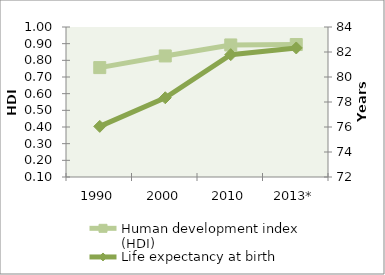
| Category | Human development index (HDI) |
|---|---|
| 1990 | 0.756 |
| 2000 | 0.826 |
| 2010 | 0.892 |
| 2013* | 0.895 |